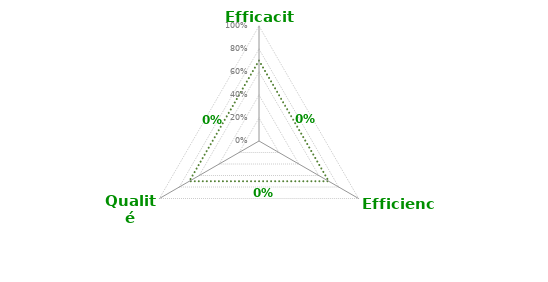
| Category | Seuil 17050 | Moyenne |
|---|---|---|
| Efficacité | 0.7 | 0 |
| Efficience | 0.7 | 0 |
| Qualité perçue | 0.7 | 0 |